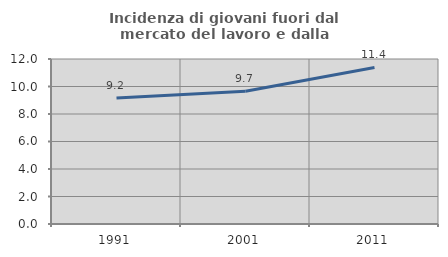
| Category | Incidenza di giovani fuori dal mercato del lavoro e dalla formazione  |
|---|---|
| 1991.0 | 9.167 |
| 2001.0 | 9.658 |
| 2011.0 | 11.386 |